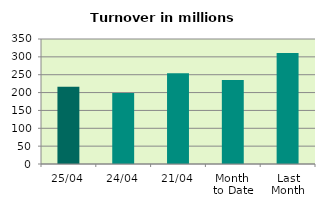
| Category | Series 0 |
|---|---|
| 25/04 | 216.278 |
| 24/04 | 198.66 |
| 21/04 | 254.113 |
| Month 
to Date | 234.89 |
| Last
Month | 310.688 |